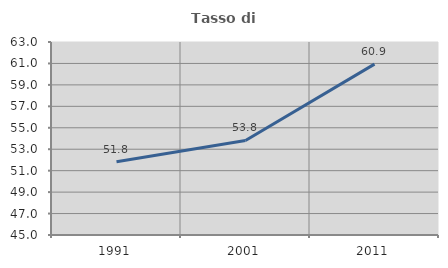
| Category | Tasso di occupazione   |
|---|---|
| 1991.0 | 51.827 |
| 2001.0 | 53.814 |
| 2011.0 | 60.933 |